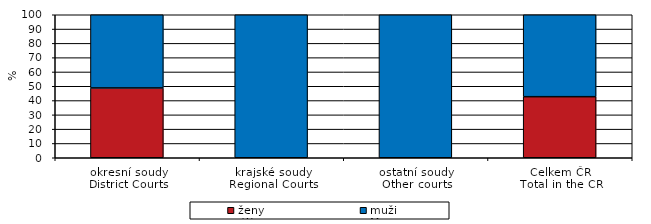
| Category | ženy
 Women | muži 
Men |
|---|---|---|
| okresní soudy
District Courts | 48.81 | 51.19 |
| krajské soudy
Regional Courts | 0 | 100 |
| ostatní soudy
Other courts | 0 | 100 |
| Celkem ČR
Total in the CR | 42.708 | 57.292 |